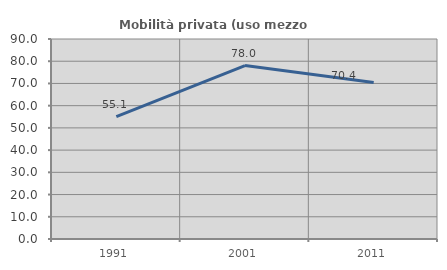
| Category | Mobilità privata (uso mezzo privato) |
|---|---|
| 1991.0 | 55.063 |
| 2001.0 | 78.049 |
| 2011.0 | 70.408 |